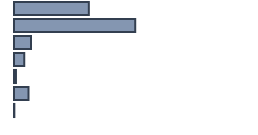
| Category | Percentatge |
|---|---|
| 0 | 31.182 |
| 1 | 50.509 |
| 2 | 7.079 |
| 3 | 4.244 |
| 4 | 0.818 |
| 5 | 6.02 |
| 6 | 0.147 |